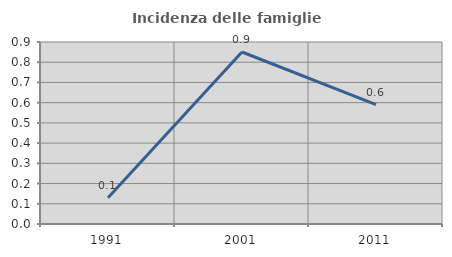
| Category | Incidenza delle famiglie numerose |
|---|---|
| 1991.0 | 0.129 |
| 2001.0 | 0.851 |
| 2011.0 | 0.59 |